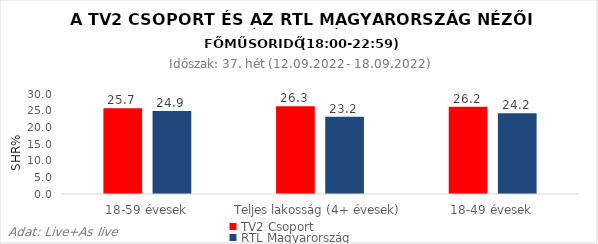
| Category | TV2 Csoport | RTL Magyarország |
|---|---|---|
| 18-59 évesek | 25.7 | 24.9 |
| Teljes lakosság (4+ évesek) | 26.3 | 23.2 |
| 18-49 évesek | 26.2 | 24.2 |